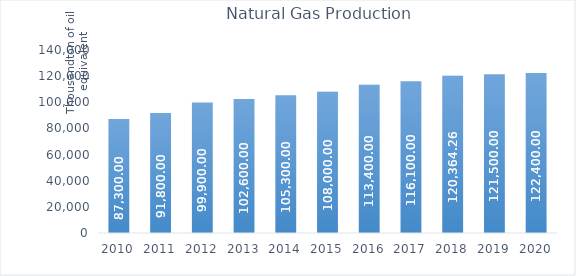
| Category | Natural Gas Production |
|---|---|
| 2010.0 | 87300 |
| 2011.0 | 91800 |
| 2012.0 | 99900 |
| 2013.0 | 102600 |
| 2014.0 | 105300 |
| 2015.0 | 108000 |
| 2016.0 | 113400 |
| 2017.0 | 116100 |
| 2018.0 | 120364.26 |
| 2019.0 | 121500 |
| 2020.0 | 122400 |